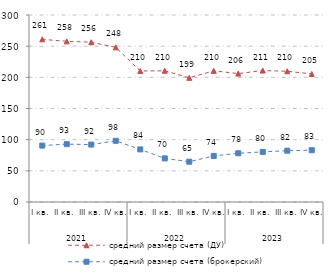
| Category | средний размер счета (ДУ) | средний размер счета (брокерский) |
|---|---|---|
| 0 | 260.93 | 90.496 |
| 1 | 257.735 | 92.83 |
| 2 | 256.302 | 92.137 |
| 3 | 248.139 | 98.17 |
| 4 | 210.169 | 84.356 |
| 5 | 210.495 | 69.946 |
| 6 | 199.204 | 64.633 |
| 7 | 210.396 | 73.898 |
| 8 | 206.035 | 78.208 |
| 9 | 210.852 | 80.377 |
| 10 | 209.779 | 82.319 |
| 11 | 205.388 | 83.071 |